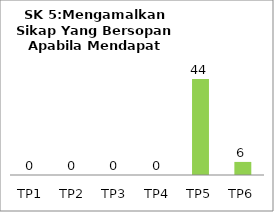
| Category | Bil Pel |
|---|---|
| TP1 | 0 |
| TP2 | 0 |
| TP3 | 0 |
| TP4 | 0 |
| TP5 | 44 |
| TP6 | 6 |